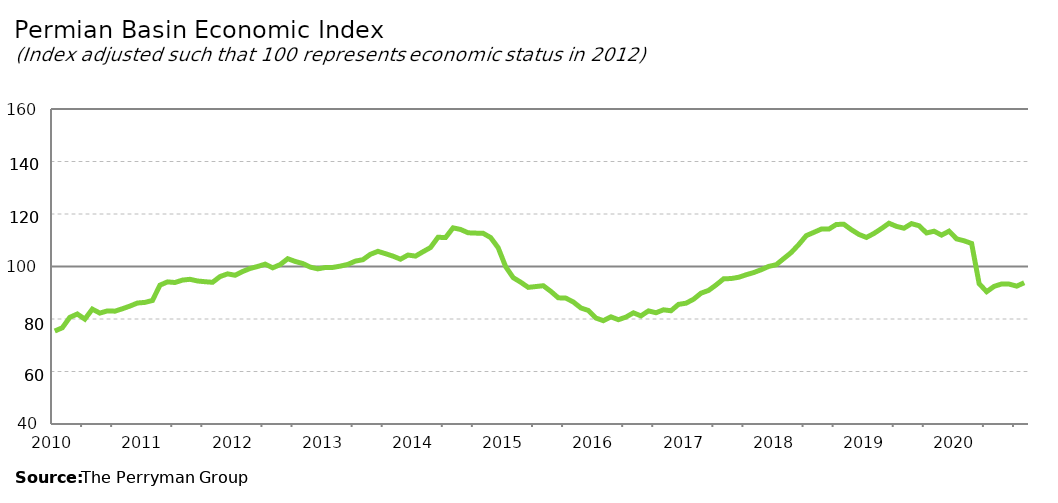
| Category | Permian Basin Composite |
|---|---|
| 2010-01-31 | 75.417 |
| 2010-02-28 | 76.646 |
| 2010-03-31 | 80.621 |
| 2010-04-30 | 81.904 |
| 2010-05-31 | 79.945 |
| 2010-06-30 | 83.758 |
| 2010-07-31 | 82.251 |
| 2010-08-31 | 83.082 |
| 2010-09-30 | 82.983 |
| 2010-10-31 | 83.9 |
| 2010-11-30 | 84.919 |
| 2010-12-31 | 86.085 |
| 2011-01-31 | 86.329 |
| 2011-02-28 | 87.057 |
| 2011-03-31 | 92.894 |
| 2011-04-30 | 94.14 |
| 2011-05-31 | 93.902 |
| 2011-06-30 | 94.828 |
| 2011-07-31 | 95.115 |
| 2011-08-31 | 94.482 |
| 2011-09-30 | 94.198 |
| 2011-10-31 | 93.984 |
| 2011-11-30 | 96.174 |
| 2011-12-31 | 97.197 |
| 2012-01-31 | 96.662 |
| 2012-02-29 | 98.092 |
| 2012-03-31 | 99.259 |
| 2012-04-30 | 100.009 |
| 2012-05-31 | 100.903 |
| 2012-06-30 | 99.494 |
| 2012-07-31 | 100.733 |
| 2012-08-31 | 102.962 |
| 2012-09-30 | 101.917 |
| 2012-10-31 | 101.139 |
| 2012-11-30 | 99.761 |
| 2012-12-31 | 99.101 |
| 2013-01-31 | 99.618 |
| 2013-02-28 | 99.65 |
| 2013-03-31 | 100.147 |
| 2013-04-30 | 100.803 |
| 2013-05-31 | 102.053 |
| 2013-06-30 | 102.594 |
| 2013-07-31 | 104.643 |
| 2013-08-31 | 105.775 |
| 2013-09-30 | 104.884 |
| 2013-10-31 | 103.96 |
| 2013-11-30 | 102.787 |
| 2013-12-31 | 104.368 |
| 2014-01-31 | 103.958 |
| 2014-02-28 | 105.625 |
| 2014-03-31 | 107.235 |
| 2014-04-30 | 111.136 |
| 2014-05-31 | 111.025 |
| 2014-06-30 | 114.723 |
| 2014-07-31 | 114.111 |
| 2014-08-31 | 112.84 |
| 2014-09-30 | 112.721 |
| 2014-10-31 | 112.651 |
| 2014-11-30 | 111.014 |
| 2014-12-31 | 107.158 |
| 2015-01-31 | 99.918 |
| 2015-02-28 | 95.755 |
| 2015-03-31 | 94.009 |
| 2015-04-30 | 92.053 |
| 2015-05-31 | 92.354 |
| 2015-06-30 | 92.679 |
| 2015-07-31 | 90.552 |
| 2015-08-31 | 88.068 |
| 2015-09-30 | 87.954 |
| 2015-10-31 | 86.493 |
| 2015-11-30 | 84.222 |
| 2015-12-31 | 83.245 |
| 2016-01-31 | 80.376 |
| 2016-02-29 | 79.355 |
| 2016-03-31 | 80.827 |
| 2016-04-30 | 79.732 |
| 2016-05-31 | 80.73 |
| 2016-06-30 | 82.35 |
| 2016-07-31 | 81.187 |
| 2016-08-31 | 83.085 |
| 2016-09-30 | 82.386 |
| 2016-10-31 | 83.501 |
| 2016-11-30 | 83.142 |
| 2016-12-31 | 85.57 |
| 2017-01-31 | 86.019 |
| 2017-02-28 | 87.535 |
| 2017-03-31 | 89.849 |
| 2017-04-30 | 90.892 |
| 2017-05-31 | 92.972 |
| 2017-06-30 | 95.303 |
| 2017-07-31 | 95.415 |
| 2017-08-31 | 95.894 |
| 2017-09-30 | 96.86 |
| 2017-10-31 | 97.689 |
| 2017-11-30 | 98.774 |
| 2017-12-31 | 100.035 |
| 2018-01-31 | 100.684 |
| 2018-02-28 | 103.023 |
| 2018-03-31 | 105.332 |
| 2018-04-30 | 108.374 |
| 2018-05-31 | 111.769 |
| 2018-06-30 | 112.999 |
| 2018-07-31 | 114.256 |
| 2018-08-31 | 114.241 |
| 2018-09-30 | 116.026 |
| 2018-10-31 | 116.083 |
| 2018-11-30 | 114.016 |
| 2018-12-31 | 112.23 |
| 2019-01-31 | 111.07 |
| 2019-02-28 | 112.582 |
| 2019-03-31 | 114.45 |
| 2019-04-30 | 116.48 |
| 2019-05-31 | 115.286 |
| 2019-06-30 | 114.588 |
| 2019-07-31 | 116.337 |
| 2019-08-31 | 115.526 |
| 2019-09-30 | 112.782 |
| 2019-10-31 | 113.44 |
| 2019-11-30 | 111.961 |
| 2019-12-31 | 113.465 |
| 2020-01-31 | 110.525 |
| 2020-02-29 | 109.79 |
| 2020-03-31 | 108.765 |
| 2020-04-30 | 93.465 |
| 2020-05-31 | 90.407 |
| 2020-06-30 | 92.442 |
| 2020-07-31 | 93.359 |
| 2020-08-31 | 93.289 |
| 2020-09-30 | 92.52 |
| 2020-10-01 | 93.812 |